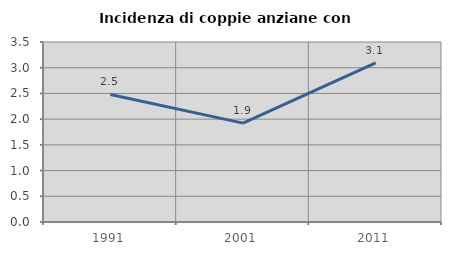
| Category | Incidenza di coppie anziane con figli |
|---|---|
| 1991.0 | 2.479 |
| 2001.0 | 1.923 |
| 2011.0 | 3.093 |